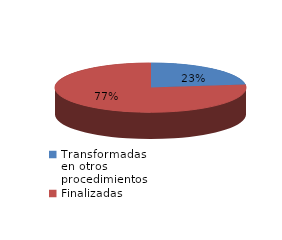
| Category | Series 0 |
|---|---|
| Transformadas en otros procedimientos | 3664 |
| Finalizadas | 12273 |